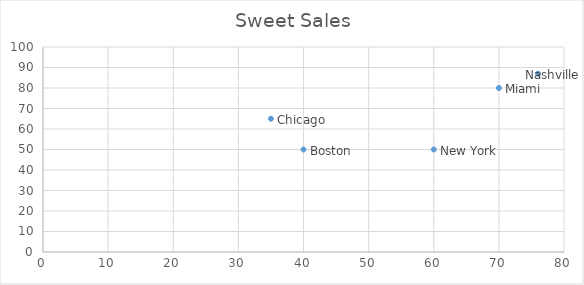
| Category | Soda |
|---|---|
| 40.0 | 50 |
| 60.0 | 50 |
| 70.0 | 80 |
| 35.0 | 65 |
| 76.0 | 87 |